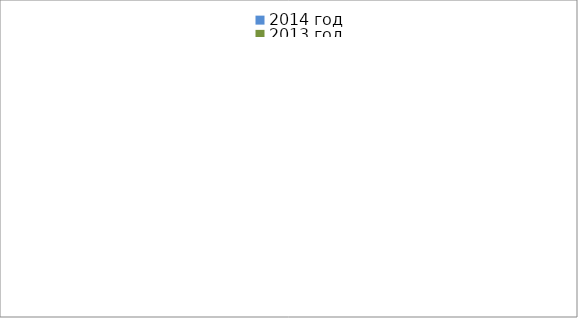
| Category | 2014 год | 2013 год |
|---|---|---|
|  - поджог | 13 | 25 |
|  - неосторожное обращение с огнём | 27 | 34 |
|  - НПТЭ электрооборудования | 15 | 18 |
|  - НПУ и Э печей | 45 | 36 |
|  - НПУ и Э транспортных средств | 47 | 44 |
|   -Шалость с огнем детей | 0 | 3 |
|  -НППБ при эксплуатации эл.приборов | 16 | 19 |
|  - курение | 17 | 9 |
| - прочие | 68 | 60 |
| - не установленные причины | 9 | 1 |